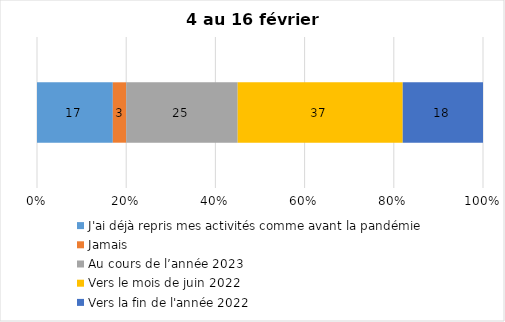
| Category | J'ai déjà repris mes activités comme avant la pandémie | Jamais | Au cours de l’année 2023 | Vers le mois de juin 2022 | Vers la fin de l'année 2022 |
|---|---|---|---|---|---|
| 0 | 17 | 3 | 25 | 37 | 18 |